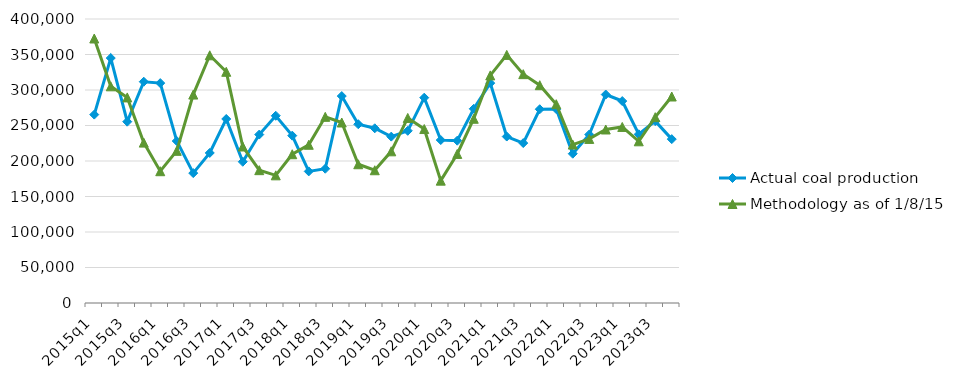
| Category | Actual coal production | Methodology as of 1/8/15 |
|---|---|---|
| 2015q1 | 265340 | 372549 |
| 2015q2 | 345009 | 305178 |
| 2015q3 | 255376 | 289567 |
| 2015q4 | 311665 | 225902 |
| 2016q1 | 309714 | 185626 |
| 2016q2 | 228144 | 214292 |
| 2016q3 | 182936 | 293555 |
| 2016q4 | 211328 | 348887 |
| 2017q1 | 259169 | 325648 |
| 2017q2 | 198939 | 220402 |
| 2017q3 | 237246 | 187090 |
| 2017q4 | 263714 | 179813 |
| 2018q1 | 235703 | 209540 |
| 2018q2 | 185359 | 222845 |
| 2018q3 | 189108 | 262189 |
| 2018q4 | 291471 | 254204 |
| 2019q1 | 251782 | 195433 |
| 2019q2 | 246076 | 186991 |
| 2019q3 | 234309 | 213624 |
| 2019q4 | 242535 | 260632 |
| 2020q1 | 289159 | 245013 |
| 2020q2 | 229531 | 172319 |
| 2020q3 | 228597 | 209952 |
| 2020q4 | 273583 | 259504 |
| 2021q1 | 309699 | 320555 |
| 2021q2 | 234450 | 349465 |
| 2021q3 | 225244 | 322318 |
| 2021q4 | 272895 | 306761 |
| 2022q1 | 273106 | 280039 |
| 2022q2 | 210259 | 223169 |
| 2022q3 | 237304 | 231108 |
| 2022q4 | 293638 | 244375 |
| 2023q1 | 284439 | 247969 |
| 2023q2 | 237624 | 227735 |
| 2023q3 | 256126 | 261746 |
| 2023q4 | 230805 | 290831 |